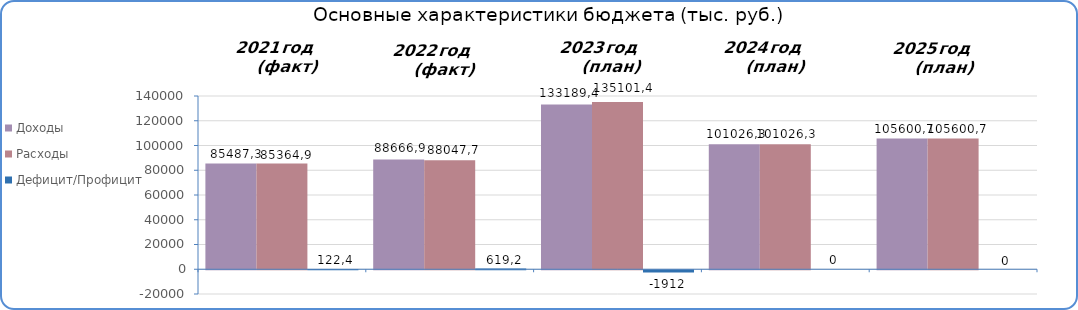
| Category | Доходы | Расходы | Дефицит/Профицит |
|---|---|---|---|
| 2021.0 | 85487.3 | 85364.9 | 122.4 |
| 2022.0 | 88666.9 | 88047.7 | 619.2 |
| 2023.0 | 133189.4 | 135101.4 | -1912 |
| 2024.0 | 101026.3 | 101026.3 | 0 |
| 2025.0 | 105600.7 | 105600.7 | 0 |